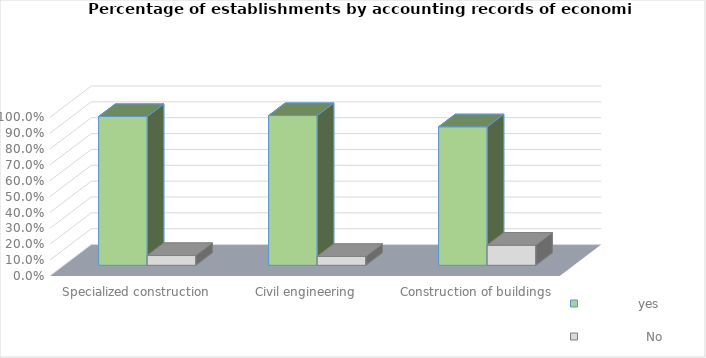
| Category |               yes     |                 No    |
|---|---|---|
|  Construction of buildings | 0.873 | 0.127 |
|  Civil engineering | 0.944 | 0.056 |
| Specialized construction activities | 0.938 | 0.062 |